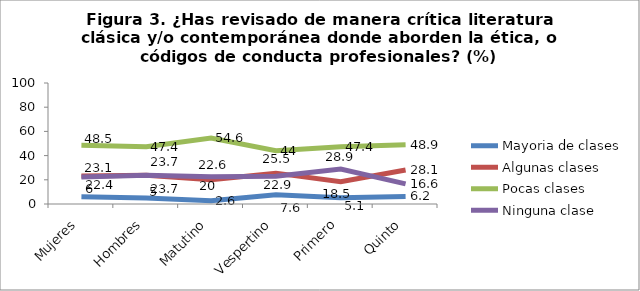
| Category | Mayoria de clases | Algunas clases | Pocas clases | Ninguna clase |
|---|---|---|---|---|
| Mujeres | 6 | 23.1 | 48.5 | 22.4 |
| Hombres | 5 | 23.7 | 47.4 | 23.7 |
| Matutino | 2.6 | 20 | 54.6 | 22.6 |
| Vespertino | 7.6 | 25.5 | 44 | 22.9 |
| Primero | 5.1 | 18.5 | 47.4 | 28.9 |
| Quinto | 6.2 | 28.1 | 48.9 | 16.6 |